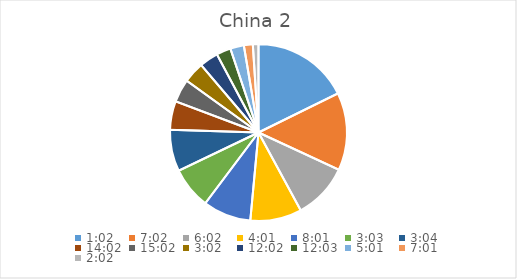
| Category | Series 0 |
|---|---|
| 0.04305555555555556 | 18.607 |
| 0.29305555555555557 | 14.886 |
| 0.2513888888888889 | 10.682 |
| 0.1673611111111111 | 9.858 |
| 0.3340277777777778 | 9.217 |
| 0.12708333333333333 | 8.006 |
| 0.1277777777777778 | 7.958 |
| 0.5847222222222223 | 5.503 |
| 0.6263888888888889 | 4.439 |
| 0.12638888888888888 | 4.038 |
| 0.5013888888888889 | 3.595 |
| 0.5020833333333333 | 2.764 |
| 0.20902777777777778 | 2.613 |
| 0.2923611111111111 | 1.713 |
| 0.08472222222222221 | 1.079 |